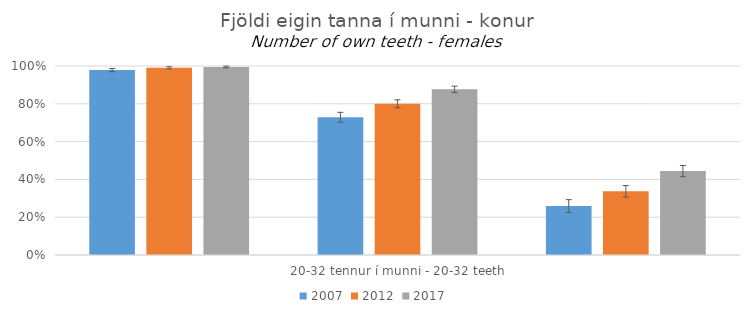
| Category | 2007 | 2012 | 2017 |
|---|---|---|---|
| 0 | 0.978 | 0.991 | 0.995 |
| 1 | 0.729 | 0.8 | 0.877 |
| 2 | 0.259 | 0.337 | 0.444 |